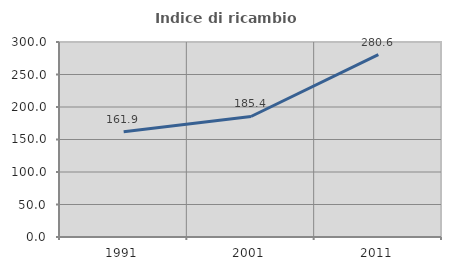
| Category | Indice di ricambio occupazionale  |
|---|---|
| 1991.0 | 161.943 |
| 2001.0 | 185.405 |
| 2011.0 | 280.597 |